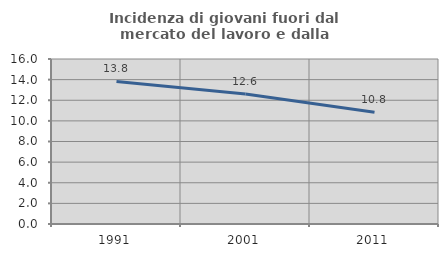
| Category | Incidenza di giovani fuori dal mercato del lavoro e dalla formazione  |
|---|---|
| 1991.0 | 13.819 |
| 2001.0 | 12.616 |
| 2011.0 | 10.84 |